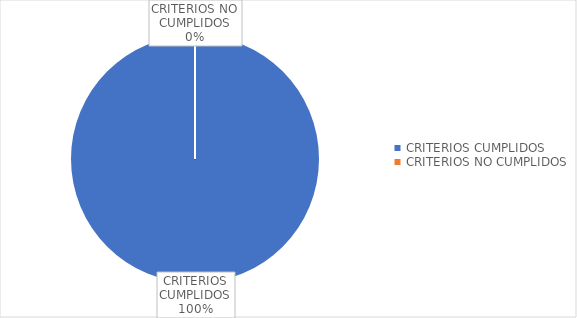
| Category | Series 0 |
|---|---|
| CRITERIOS CUMPLIDOS | 103 |
| CRITERIOS NO CUMPLIDOS | 0 |